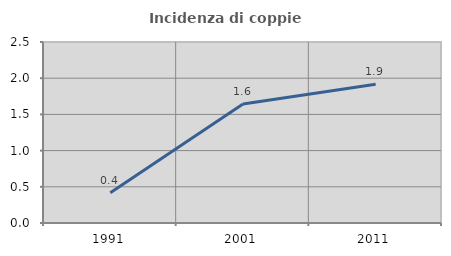
| Category | Incidenza di coppie miste |
|---|---|
| 1991.0 | 0.419 |
| 2001.0 | 1.643 |
| 2011.0 | 1.917 |